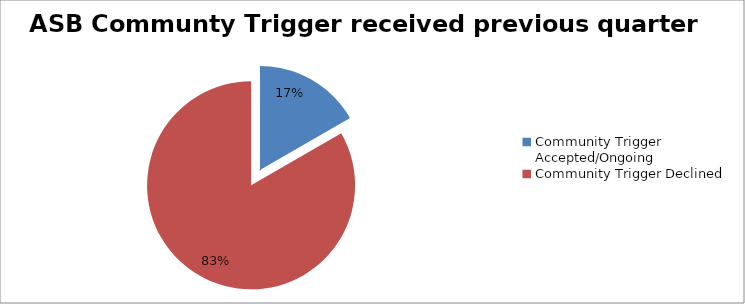
| Category | Series 0 |
|---|---|
| Community Trigger Accepted/Ongoing | 1 |
| Community Trigger Declined | 5 |